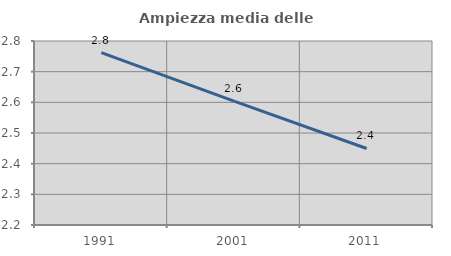
| Category | Ampiezza media delle famiglie |
|---|---|
| 1991.0 | 2.762 |
| 2001.0 | 2.604 |
| 2011.0 | 2.45 |